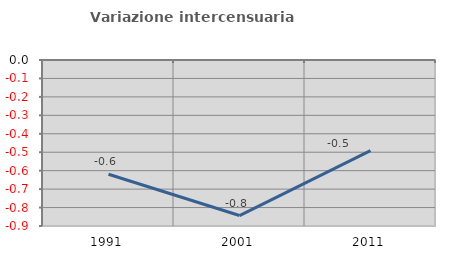
| Category | Variazione intercensuaria annua |
|---|---|
| 1991.0 | -0.619 |
| 2001.0 | -0.843 |
| 2011.0 | -0.491 |